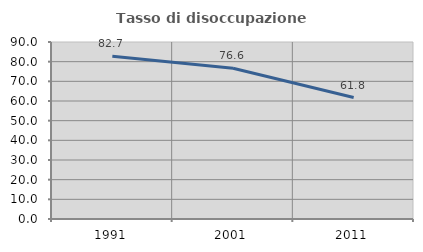
| Category | Tasso di disoccupazione giovanile  |
|---|---|
| 1991.0 | 82.742 |
| 2001.0 | 76.632 |
| 2011.0 | 61.765 |